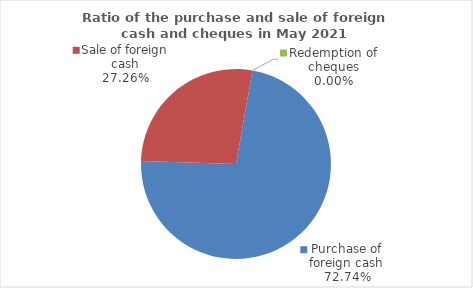
| Category | Series 0 |
|---|---|
| Purchase of foreign cash | 72.74 |
| Sale of foreign cash | 27.26 |
| Redemption of cheques | 0 |